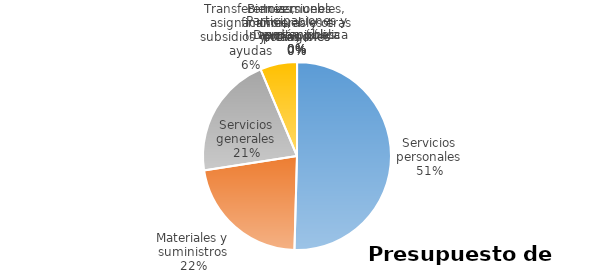
| Category | Series 0 | Series 1 | Series 2 | Series 3 | Series 4 | Series 5 |
|---|---|---|---|---|---|---|
| Servicios personales | 1726156 |  |  |  |  |  |
| Materiales y suministros | 757150 |  |  |  |  |  |
| Servicios generales | 722552 |  |  |  |  |  |
| Transferencias, asignaciones, subsidios y otras ayudas | 216905 |  |  |  |  |  |
| Bienes muebles, inmuebles e intangibles | 0 |  |  |  |  |  |
| Inversión pública | 0 |  |  |  |  |  |
| Inversiones financieras y otras provisiones | 0 |  |  |  |  |  |
| Participaciones y aportaciones | 0 |  |  |  |  |  |
| Deuda pública | 0 |  |  |  |  |  |